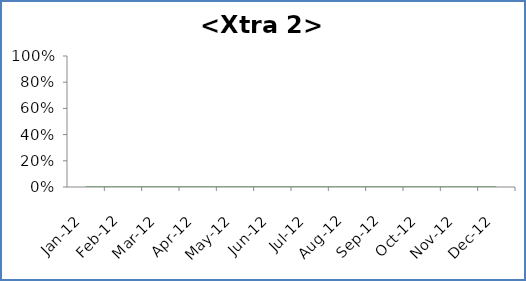
| Category | <Xtra 2> | Median | Goal |
|---|---|---|---|
| 2012-01-01 |  | 0 | 0 |
| 2012-02-01 |  | 0 | 0 |
| 2012-03-01 |  | 0 | 0 |
| 2012-04-01 |  | 0 | 0 |
| 2012-05-01 |  | 0 | 0 |
| 2012-06-01 |  | 0 | 0 |
| 2012-07-01 |  | 0 | 0 |
| 2012-08-01 |  | 0 | 0 |
| 2012-09-01 |  | 0 | 0 |
| 2012-10-01 |  | 0 | 0 |
| 2012-11-01 |  | 0 | 0 |
| 2012-12-01 |  | 0 | 0 |